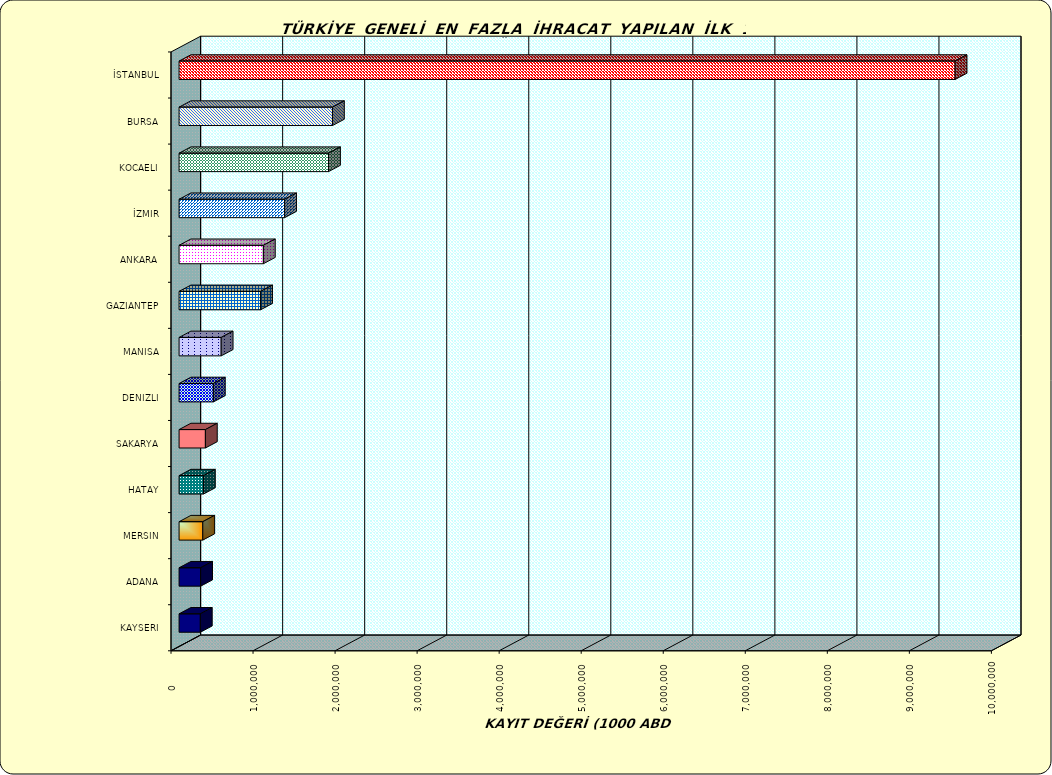
| Category | Series 0 |
|---|---|
| İSTANBUL | 9459409.743 |
| BURSA | 1869809.013 |
| KOCAELI | 1821893.517 |
| İZMIR | 1286358.825 |
| ANKARA | 1027607.596 |
| GAZIANTEP | 993978.551 |
| MANISA | 513314.973 |
| DENIZLI | 418098.303 |
| SAKARYA | 320781.287 |
| HATAY | 296736.934 |
| MERSIN | 289078.869 |
| ADANA | 262946.055 |
| KAYSERI | 259119.725 |